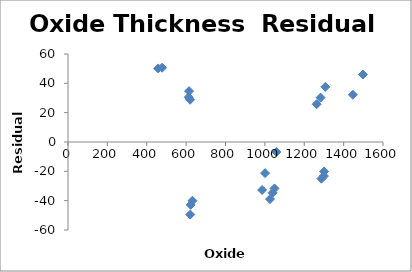
| Category | Series 0 |
|---|---|
| 1059.0 | -6.787 |
| 1049.0 | -31.654 |
| 1039.0 | -34.608 |
| 1026.0 | -38.93 |
| 1001.0 | -21.224 |
| 986.0 | -32.714 |
| 1447.0 | 32.188 |
| 458.0 | 50.156 |
| 1263.0 | 25.75 |
| 1283.0 | 30.255 |
| 1301.0 | -20.064 |
| 1287.0 | -25.011 |
| 1300.0 | -23.219 |
| 1307.0 | 37.571 |
| 632.0 | -40.045 |
| 621.0 | -49.45 |
| 623.0 | -42.861 |
| 620.0 | 28.812 |
| 613.0 | 30.506 |
| 615.0 | 34.694 |
| 478.0 | 50.649 |
| 1498.0 | 45.987 |